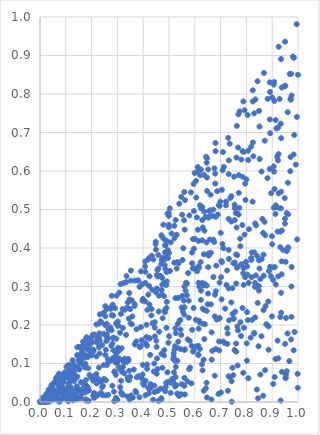
| Category | Series 0 |
|---|---|
| 0.833959607777957 | 0.309 |
| 0.6226710553488027 | 0.363 |
| 0.8251685102199416 | 0.674 |
| 0.012151044901735353 | 0.003 |
| 0.5100612519025949 | 0.438 |
| 0.18344398618494706 | 0.117 |
| 0.8451205923420376 | 0.01 |
| 0.28366670640286307 | 0.166 |
| 0.41277147064092334 | 0.201 |
| 0.012035645954408869 | 0.01 |
| 0.5590432025219347 | 0.227 |
| 0.4746178525892809 | 0.089 |
| 0.5367674675868574 | 0.36 |
| 0.6646893869289398 | 0.006 |
| 0.4807313719696039 | 0.275 |
| 0.45396182067385993 | 0.113 |
| 0.5211889334310936 | 0.136 |
| 0.5491861876958413 | 0.047 |
| 0.604805082778155 | 0.574 |
| 0.6305408393509706 | 0.242 |
| 0.754084257331752 | 0.135 |
| 0.5894717655045798 | 0.388 |
| 0.34763606515275536 | 0.006 |
| 0.8592274394965205 | 0.371 |
| 0.09431606015589489 | 0.033 |
| 0.7606637263769419 | 0.308 |
| 0.7229621349828271 | 0.304 |
| 0.11152272997416401 | 0.077 |
| 0.6814482297791011 | 0.481 |
| 0.39713254151396615 | 0.263 |
| 0.5211859210822416 | 0.047 |
| 0.4159052331790971 | 0.239 |
| 0.241000881381631 | 0.039 |
| 0.6623907402288559 | 0.388 |
| 0.6169430710544703 | 0.211 |
| 0.6145140374580985 | 0.31 |
| 0.8947439840404324 | 0.327 |
| 0.33929217641608544 | 0.014 |
| 0.6965676998924749 | 0.509 |
| 0.24132786487038038 | 0.018 |
| 0.07355799330908541 | 0.024 |
| 0.6722575808812681 | 0.324 |
| 0.17070888375426452 | 0.154 |
| 0.2901540970800738 | 0.08 |
| 0.19177080434794314 | 0.07 |
| 0.328968232632865 | 0.112 |
| 0.9520864763153227 | 0.364 |
| 0.6588788865575279 | 0.483 |
| 0.17969806234709285 | 0.041 |
| 0.7419712597005883 | 0.469 |
| 0.7953537723282129 | 0.567 |
| 0.5357532160614694 | 0.157 |
| 0.00012499267659760172 | 0 |
| 0.28786149217454327 | 0.078 |
| 0.2848459201069923 | 0.167 |
| 0.3831961423888054 | 0.067 |
| 0.21846065643484724 | 0.019 |
| 0.9084010968984554 | 0.782 |
| 0.9830189537162006 | 0.643 |
| 0.1742334713301722 | 0.144 |
| 0.15863424309363738 | 0.032 |
| 0.3514246953496212 | 0.204 |
| 0.8873149427223269 | 0.34 |
| 0.7541911592951978 | 0.512 |
| 0.0013404993351963101 | 0.001 |
| 0.026551623690384107 | 0.003 |
| 0.5590089431235028 | 0.042 |
| 0.36362376207292246 | 0.084 |
| 0.31437262872194016 | 0.055 |
| 0.931339032026711 | 0.402 |
| 0.45873597192071924 | 0.346 |
| 0.9349253417569103 | 0.232 |
| 0.4554594115107503 | 0.086 |
| 0.7851669524816784 | 0.244 |
| 0.07399829673349656 | 0.074 |
| 0.17569508749476015 | 0.1 |
| 0.4093633814592911 | 0.153 |
| 0.03259081062714586 | 0.02 |
| 0.6154326280270119 | 0.353 |
| 0.7324862995069761 | 0.372 |
| 0.8860631247897502 | 0.196 |
| 0.8268809891996235 | 0.638 |
| 0.0652342487036972 | 0.065 |
| 0.13265059318889771 | 0.078 |
| 0.8330064581968353 | 0.299 |
| 0.8378015006847976 | 0.459 |
| 0.7089843072402539 | 0.649 |
| 0.9342638891222894 | 0.891 |
| 0.4153781210567363 | 0.097 |
| 0.9839243708806429 | 0.894 |
| 0.7771537061452198 | 0.207 |
| 0.675995772559029 | 0.607 |
| 0.00022824409497024245 | 0 |
| 0.24314693610482208 | 0.042 |
| 0.32518291074286587 | 0.104 |
| 0.7850261044026805 | 0.651 |
| 0.05876385626744096 | 0.05 |
| 0.057420324258755984 | 0.025 |
| 0.0009933494473034488 | 0.001 |
| 0.5601404564813833 | 0.3 |
| 0.8723782409775844 | 0.083 |
| 0.4530186476020873 | 0.294 |
| 0.1966988673270469 | 0.166 |
| 0.2556596154903146 | 0.056 |
| 0.6360563813327799 | 0.494 |
| 0.17795882003242602 | 0.163 |
| 0.11704720859172668 | 0.065 |
| 0.6080444964961748 | 0.597 |
| 0.5228279167537708 | 0.145 |
| 0.7547765485086769 | 0.504 |
| 0.20620483672189394 | 0.056 |
| 0.1671974046558482 | 0.049 |
| 0.6458250187442274 | 0.622 |
| 0.45666417532194437 | 0.029 |
| 0.17573678013603422 | 0.03 |
| 0.47970845637960546 | 0.309 |
| 0.42714531539202305 | 0.122 |
| 0.6135932999505098 | 0.146 |
| 0.5193388570370386 | 0.077 |
| 0.8012105932541005 | 0.152 |
| 0.08939917987980972 | 0.067 |
| 0.0701271884628798 | 0.003 |
| 0.010058383971933482 | 0 |
| 0.03218893167927073 | 0.025 |
| 0.4949036240662573 | 0.052 |
| 0.614179205393404 | 0.349 |
| 0.6454982497632263 | 0.415 |
| 0.21002814752022125 | 0.011 |
| 0.913449701912242 | 0.511 |
| 0.2820436860818025 | 0.114 |
| 0.4736522631794605 | 0.429 |
| 0.8918598451230361 | 0.351 |
| 0.6470528169451691 | 0.583 |
| 0.2934280004258568 | 0.119 |
| 0.13203194914779937 | 0.069 |
| 0.12139377690033448 | 0.036 |
| 0.4223300572874672 | 0.023 |
| 0.9312798920384423 | 0.442 |
| 0.780417967334389 | 0.63 |
| 0.8542873085026029 | 0.319 |
| 0.6191035204449813 | 0.207 |
| 0.3027246130657507 | 0.141 |
| 0.9748770617847526 | 0.221 |
| 0.43219365528799714 | 0.242 |
| 0.31589254291722935 | 0.079 |
| 0.8219531956153688 | 0.213 |
| 0.8514042546203778 | 0.631 |
| 0.3074391381000995 | 0.113 |
| 0.7843229524565201 | 0.46 |
| 0.7516719460236485 | 0.216 |
| 0.03562717405975724 | 0.024 |
| 0.8430314052626063 | 0.833 |
| 0.29664460010088967 | 0.126 |
| 0.7630914587119858 | 0.349 |
| 0.6528838975686463 | 0.479 |
| 0.7494257115505281 | 0.36 |
| 0.6360950947440668 | 0.239 |
| 0.8487684091240306 | 0.368 |
| 0.42504391043390366 | 0.165 |
| 0.9958001661790685 | 0.74 |
| 0.634630115035484 | 0.303 |
| 0.6372381703803102 | 0.445 |
| 0.19891877660012625 | 0.124 |
| 0.05130026122976172 | 0.045 |
| 0.3105627770723074 | 0.18 |
| 0.6235563420179863 | 0.265 |
| 0.06106078023821604 | 0.055 |
| 0.5323320074563568 | 0.363 |
| 0.5307340171770101 | 0.141 |
| 0.6657571030286236 | 0.11 |
| 0.3987806941803924 | 0.096 |
| 0.49380380553003456 | 0.077 |
| 0.1640615101338585 | 0.022 |
| 0.9992881600094501 | 0.037 |
| 0.7735611900505899 | 0.755 |
| 0.8076349345542871 | 0.062 |
| 0.16676504852896445 | 0.156 |
| 0.11352817540246474 | 0.096 |
| 0.7874972326813441 | 0.335 |
| 0.9231383835181605 | 0.326 |
| 0.5818214327617146 | 0.089 |
| 0.5590764235792427 | 0.135 |
| 0.07218646402384887 | 0.023 |
| 0.7651902802271495 | 0.351 |
| 0.6382419952489125 | 0.307 |
| 0.005409793897956816 | 0.002 |
| 0.7284144854086841 | 0.029 |
| 0.5237259396356201 | 0.04 |
| 0.8649493175773108 | 0.439 |
| 0.32354654607456756 | 0.106 |
| 0.39931519278561156 | 0.268 |
| 0.7590959837387573 | 0.491 |
| 0.15917327652617985 | 0.01 |
| 0.5386054868129053 | 0.016 |
| 0.5956322151909318 | 0.133 |
| 0.3441336157315328 | 0.216 |
| 0.2365039836512356 | 0.208 |
| 0.30756575069617864 | 0.284 |
| 0.1537761340518986 | 0.142 |
| 0.08379912672058965 | 0.049 |
| 0.46874578643662845 | 0.327 |
| 0.12715048327276357 | 0.004 |
| 0.1925131087311035 | 0.134 |
| 0.3420041435143686 | 0.057 |
| 0.4977438988003374 | 0.154 |
| 0.13089259617364635 | 0.075 |
| 0.4202964163083702 | 0.036 |
| 0.18336322496301083 | 0.029 |
| 0.6791836721355863 | 0.593 |
| 0.4606364200192682 | 0.276 |
| 0.08415762183025066 | 0.04 |
| 0.9618032772461186 | 0.488 |
| 0.8960865616772591 | 0.542 |
| 0.6469249859818891 | 0.633 |
| 0.265123813505857 | 0.189 |
| 0.18903863786529784 | 0.003 |
| 0.09122553900266339 | 0.032 |
| 0.044374047453418886 | 0.044 |
| 0.023458868025167057 | 0.009 |
| 0.68159061267177 | 0.288 |
| 0.19240803568806497 | 0.147 |
| 0.27437358079804364 | 0.242 |
| 0.48718013156291595 | 0.039 |
| 0.2905249983109318 | 0.244 |
| 0.7460045642261214 | 0.089 |
| 0.01752089041506466 | 0.007 |
| 0.31063206381820585 | 0.086 |
| 0.16300756881896183 | 0.131 |
| 0.5342945247929611 | 0.203 |
| 0.07292131335008512 | 0.035 |
| 0.6792653849988308 | 0.567 |
| 0.10993474614097842 | 0.002 |
| 0.28093259177713514 | 0.152 |
| 0.11353467199177192 | 0.031 |
| 0.3859770604652849 | 0.143 |
| 0.6717385534901874 | 0.421 |
| 0.17859016227024327 | 0.142 |
| 0.7051501977824058 | 0.551 |
| 0.6848825939043971 | 0.214 |
| 0.20280251730611476 | 0.156 |
| 0.3206382633075894 | 0.242 |
| 0.003879752239746459 | 0.001 |
| 0.6389302638676487 | 0.202 |
| 0.29116972424189713 | 0.103 |
| 0.46213489313264156 | 0.328 |
| 0.27008998687326147 | 0.189 |
| 0.03371226121474491 | 0.032 |
| 0.312766847037799 | 0.306 |
| 0.7004183731758292 | 0.439 |
| 0.48596632299771303 | 0.346 |
| 0.04684658716814971 | 0.012 |
| 0.25815406436819865 | 0.169 |
| 0.09268364599441792 | 0.06 |
| 0.7600152142725528 | 0.152 |
| 0.10316793061152063 | 0.015 |
| 0.5993857320656898 | 0.595 |
| 0.45534937054975644 | 0.326 |
| 0.1322812148121819 | 0.054 |
| 0.6003271025132341 | 0.347 |
| 0.6803432003481387 | 0.673 |
| 0.7039524253777582 | 0.267 |
| 0.1068169246598818 | 0.02 |
| 0.5126687913076894 | 0.06 |
| 0.7709069489476759 | 0.589 |
| 0.09186608797823204 | 0.011 |
| 0.1238448932752243 | 0.026 |
| 0.026219618310704962 | 0.007 |
| 0.7416305989574528 | 0.535 |
| 0.12080840651573455 | 0.083 |
| 0.8056403300990217 | 0.213 |
| 0.735502343685895 | 0.671 |
| 0.6750887692753811 | 0.416 |
| 0.03911077516889916 | 0.035 |
| 0.8907726450044473 | 0.734 |
| 0.1446820147846012 | 0.142 |
| 0.5239364366078132 | 0.107 |
| 0.44785518640265454 | 0.41 |
| 0.16938684758409173 | 0.115 |
| 0.2784157744533058 | 0.276 |
| 0.13657755155522489 | 0.014 |
| 0.52074095761606 | 0.458 |
| 0.37028483268959445 | 0.028 |
| 0.5151927915199133 | 0.058 |
| 0.6537336563456011 | 0.38 |
| 0.5259590532087067 | 0.179 |
| 0.7106167858561093 | 0.399 |
| 0.33332677230611873 | 0.311 |
| 0.7079614377775263 | 0.602 |
| 0.44933634196347216 | 0.396 |
| 0.15485469147707331 | 0.012 |
| 0.5583173173764115 | 0.472 |
| 0.6173973045862329 | 0.3 |
| 0.0174165863986967 | 0.001 |
| 0.9090396055887607 | 0.553 |
| 0.5695108375879797 | 0.277 |
| 0.06615958233106223 | 0.011 |
| 0.07684801128094276 | 0.042 |
| 0.4701828510059358 | 0.358 |
| 0.6607049933443183 | 0.498 |
| 0.109788446425514 | 0.007 |
| 0.7072601835574871 | 0.41 |
| 0.834061370843019 | 0.464 |
| 0.9251251527490173 | 0.542 |
| 0.6210697669735781 | 0.589 |
| 0.49126234836140037 | 0.26 |
| 0.44416475432843516 | 0.026 |
| 0.26342542052429074 | 0.111 |
| 0.9247442024503574 | 0.644 |
| 0.6348517263677957 | 0.029 |
| 0.3662801395602844 | 0.315 |
| 0.9194714565838554 | 0.637 |
| 0.7312795276914247 | 0.476 |
| 0.8586787878264481 | 0.599 |
| 0.8405229008822986 | 0.032 |
| 0.4705264714382392 | 0.01 |
| 0.9752549321394042 | 0.796 |
| 0.524736487670914 | 0.191 |
| 0.4031796420946995 | 0.044 |
| 0.9058240386377426 | 0.825 |
| 0.8046975446028467 | 0.745 |
| 0.1866503376939732 | 0.088 |
| 0.09746370231051549 | 0.014 |
| 0.1403202329936425 | 0.03 |
| 0.16947671140377507 | 0.156 |
| 0.14905327613137487 | 0.107 |
| 0.033987579731038164 | 0.028 |
| 0.9002177004255609 | 0.41 |
| 0.25317142600392795 | 0.249 |
| 0.06984769335239926 | 0.055 |
| 0.14695486551239667 | 0.092 |
| 0.9332824450294477 | 0.723 |
| 0.15235243962600564 | 0.084 |
| 0.20434698802761264 | 0.174 |
| 0.22099973495467273 | 0.016 |
| 0.1759302817048667 | 0.045 |
| 0.3666544766498625 | 0.25 |
| 0.3218183979605178 | 0.091 |
| 0.08358583511380069 | 0.045 |
| 0.52047309734992 | 0.362 |
| 0.8184968746569611 | 0.374 |
| 0.7311440164982931 | 0.295 |
| 0.7456369022538248 | 0.296 |
| 0.4824591912336822 | 0.033 |
| 0.31645436872376653 | 0.14 |
| 0.6054712570546911 | 0.531 |
| 0.4077367935563775 | 0.365 |
| 0.3677754989956098 | 0.149 |
| 0.23700594667030817 | 0.054 |
| 0.48465975533036576 | 0.389 |
| 0.6611170084690242 | 0.539 |
| 0.48182607322437787 | 0.135 |
| 0.9070298105162466 | 0.598 |
| 0.5929165161256216 | 0.423 |
| 0.4695236778267493 | 0.006 |
| 0.5300620625689053 | 0.434 |
| 0.5765988237623709 | 0.219 |
| 0.6939150183138585 | 0.157 |
| 0.28431391163891295 | 0.134 |
| 0.6776279457164229 | 0.222 |
| 0.18032230244515313 | 0.168 |
| 0.17790450404980174 | 0.007 |
| 0.29424246100041807 | 0.011 |
| 0.2002202019729119 | 0.122 |
| 0.8300762103303957 | 0.18 |
| 0.07605762905105762 | 0.059 |
| 0.27784363861575667 | 0.226 |
| 0.43510655316920965 | 0.291 |
| 0.4359981239190699 | 0.205 |
| 0.6991444847292607 | 0.52 |
| 0.25914169598510084 | 0.176 |
| 0.6308840146389669 | 0.453 |
| 0.23146037569273692 | 0.16 |
| 0.5609150719514316 | 0.448 |
| 0.5211258601368414 | 0.425 |
| 0.47292264202881074 | 0.279 |
| 0.9164122228630264 | 0.71 |
| 0.02132060576485073 | 0.006 |
| 0.5285503586335774 | 0.044 |
| 0.3356892358057232 | 0.104 |
| 0.006076094320715764 | 0.001 |
| 0.5783042387754592 | 0.085 |
| 0.15292011433330321 | 0.143 |
| 0.7310622843068386 | 0.395 |
| 0.061768810295306564 | 0.061 |
| 0.47330683696121467 | 0.322 |
| 0.7885337274794323 | 0.348 |
| 0.9663632842821747 | 0.106 |
| 0.09041043371832735 | 0.052 |
| 0.3914538839761007 | 0.146 |
| 0.3737974340948247 | 0.189 |
| 0.2301107302432024 | 0.178 |
| 0.18415478961437537 | 0.153 |
| 0.7755990318721112 | 0.424 |
| 0.9711388401378247 | 0.636 |
| 0.30188325070982114 | 0.209 |
| 0.8900667941272077 | 0.606 |
| 0.9562821249112973 | 0.491 |
| 0.1995387302620295 | 0.156 |
| 0.7855416258486917 | 0.585 |
| 0.80018411004283 | 0.578 |
| 0.4709816934934684 | 0.433 |
| 0.49937000127685427 | 0.454 |
| 0.3492770445981559 | 0.241 |
| 0.2985622670040029 | 0.104 |
| 0.3354262001809596 | 0.327 |
| 0.30216815314633616 | 0.131 |
| 0.8469356866281121 | 0.145 |
| 0.16601055325174796 | 0.146 |
| 0.31770265840907197 | 0.02 |
| 0.7466769929050261 | 0.229 |
| 0.9702085603128222 | 0.6 |
| 0.037293021643189594 | 0.006 |
| 0.045224243615643256 | 0.006 |
| 0.7175535875854553 | 0.242 |
| 0.10761661899143571 | 0.024 |
| 0.42706897764005236 | 0.036 |
| 0.22023258715065985 | 0.05 |
| 0.8037279811422882 | 0.331 |
| 0.5315009155925511 | 0.022 |
| 0.09649286142749802 | 0.077 |
| 0.7950540302063315 | 0.324 |
| 0.8702663150289356 | 0.468 |
| 0.6463518738948396 | 0.302 |
| 0.11352852657249335 | 0.061 |
| 0.97533031690708 | 0.351 |
| 0.36676503306104447 | 0.255 |
| 0.6080985089563959 | 0.48 |
| 0.6514577230009592 | 0.282 |
| 0.019367671040001366 | 0 |
| 0.6534071358532898 | 0.386 |
| 0.9470833122979553 | 0.82 |
| 0.10949548509197371 | 0.041 |
| 0.9124631997062107 | 0.488 |
| 0.3469766425376679 | 0.266 |
| 0.4083573482315336 | 0.261 |
| 0.14471703188814744 | 0.03 |
| 0.899949236352063 | 0.791 |
| 0.9719082507130902 | 0.785 |
| 0.9287630298917388 | 0.787 |
| 0.6285785205073489 | 0.507 |
| 0.3421468771982954 | 0.112 |
| 0.16489858669580837 | 0.14 |
| 0.23225031883322955 | 0.228 |
| 0.9499682263682483 | 0.936 |
| 0.60528591660158 | 0.145 |
| 0.8991352854225045 | 0.431 |
| 0.9969589493307961 | 0.422 |
| 0.4858951780225206 | 0.407 |
| 0.8663556503366516 | 0.383 |
| 0.7127765909752171 | 0.611 |
| 0.20636506583495262 | 0.136 |
| 0.03998135719348472 | 0.026 |
| 0.36906582392193343 | 0.152 |
| 0.5259341938787029 | 0.473 |
| 0.3495434326537076 | 0.065 |
| 0.0366949992770802 | 0.033 |
| 0.14455916672019486 | 0.122 |
| 0.5034145966216028 | 0.503 |
| 0.9133467244503457 | 0.732 |
| 0.2766121874142565 | 0.146 |
| 0.624348691886188 | 0.503 |
| 0.681583630548066 | 0.138 |
| 0.7927384020902369 | 0.758 |
| 0.5551110863529584 | 0.399 |
| 0.2571739504407533 | 0.245 |
| 0.45501120046276666 | 0.343 |
| 0.5878055822865559 | 0.146 |
| 0.18146626504988828 | 0.004 |
| 0.20622538527844647 | 0.017 |
| 0.04438110764664882 | 0.024 |
| 0.7765951422327464 | 0.405 |
| 0.7294442659059436 | 0.686 |
| 0.3812142258480521 | 0.316 |
| 0.03734583602610708 | 0.023 |
| 0.7361962098078985 | 0.065 |
| 0.5474494069434721 | 0.02 |
| 0.011141857484843642 | 0.011 |
| 0.6475868214920371 | 0.548 |
| 0.9745788449215858 | 0.3 |
| 0.9497790554503536 | 0.151 |
| 0.24684616512433433 | 0.096 |
| 0.04925870762020057 | 0.034 |
| 0.08536164003830382 | 0.034 |
| 0.006366767515818106 | 0.002 |
| 0.40821140034001013 | 0.309 |
| 0.10947339730966021 | 0.011 |
| 0.7153716923693295 | 0.153 |
| 0.7626347944998788 | 0.717 |
| 0.7261587019641037 | 0.151 |
| 0.8916290708534894 | 0.805 |
| 0.5000302794975845 | 0.387 |
| 0.15083559114593348 | 0.111 |
| 0.5698224783812994 | 0.308 |
| 0.35377601348401244 | 0.017 |
| 0.42456117679547656 | 0.166 |
| 0.49113056373564035 | 0.418 |
| 0.04685599420809594 | 0.029 |
| 0.5319748484190366 | 0.107 |
| 0.39849453721204264 | 0.048 |
| 0.10503182123159827 | 0.032 |
| 0.7481232125551354 | 0.217 |
| 0.32579040899911615 | 0.309 |
| 0.2184743618247278 | 0.073 |
| 0.12644947075199675 | 0.109 |
| 0.1349177469091507 | 0.093 |
| 0.38577682075759223 | 0.299 |
| 0.9364743530108726 | 0.365 |
| 0.5597326387631563 | 0.063 |
| 0.8779984678649008 | 0.201 |
| 0.25511942973012014 | 0.135 |
| 0.3289125154133191 | 0.24 |
| 0.3978135778163039 | 0.072 |
| 0.6946158634705639 | 0.134 |
| 0.920867691715472 | 0.159 |
| 0.7313044266376523 | 0.592 |
| 0.4435068936123854 | 0.042 |
| 0.8825394297224133 | 0.788 |
| 0.1047067990519327 | 0.008 |
| 0.9215630507416424 | 0.505 |
| 0.44539245318977516 | 0.17 |
| 0.9913784871160747 | 0.617 |
| 0.2644156270762478 | 0.018 |
| 0.9040468164414891 | 0.047 |
| 0.525134263127627 | 0.27 |
| 0.7896074347644882 | 0.65 |
| 0.2873983407866336 | 0.002 |
| 0.3459482911313869 | 0.283 |
| 0.5659484559342818 | 0.31 |
| 0.22999145901868245 | 0.204 |
| 0.764954864577371 | 0.196 |
| 0.7927410465074778 | 0.435 |
| 0.8067280677071462 | 0.652 |
| 0.17564728231501547 | 0.042 |
| 0.9866169802197388 | 0.182 |
| 0.645743844465288 | 0.05 |
| 0.4091859691844453 | 0.055 |
| 0.9061003630092116 | 0.505 |
| 0.5897055442422516 | 0.36 |
| 0.25326802335691845 | 0.017 |
| 0.89236578524832 | 0.698 |
| 0.8417738490905305 | 0.379 |
| 0.7018738949177821 | 0.324 |
| 0.259879640196369 | 0.096 |
| 0.45855133834103956 | 0.382 |
| 0.9057688340580586 | 0.612 |
| 0.4714974920945373 | 0.291 |
| 0.2960069195696686 | 0.164 |
| 0.2702446091304239 | 0.106 |
| 0.030248795084024782 | 0.02 |
| 0.8908333012221306 | 0.83 |
| 0.9532539952509147 | 0.071 |
| 0.6653583252235477 | 0.181 |
| 0.4244845348741553 | 0.327 |
| 0.13907561091623277 | 0.021 |
| 0.7672746830662629 | 0.186 |
| 0.9371054460285254 | 0.817 |
| 0.3430506419455083 | 0.108 |
| 0.07089629457479174 | 0.061 |
| 0.1507989034870829 | 0.029 |
| 0.6960290259134018 | 0.218 |
| 0.16959698968780446 | 0.124 |
| 0.09989649419243596 | 0.066 |
| 0.8508252346389601 | 0.715 |
| 0.022523941372692757 | 0.018 |
| 0.9731929998947193 | 0.852 |
| 0.3557474097021992 | 0.202 |
| 0.655793947542446 | 0.496 |
| 0.5448391834023459 | 0.188 |
| 0.4994484376988696 | 0.484 |
| 0.6197003410550966 | 0.138 |
| 0.1477812869965398 | 0.029 |
| 0.17744852290243507 | 0.091 |
| 0.13957835865478785 | 0.009 |
| 0.669314464392988 | 0.483 |
| 0.6892209496778928 | 0.487 |
| 0.4755193540914381 | 0.218 |
| 0.10256779703852237 | 0.092 |
| 0.1816107035939203 | 0.041 |
| 0.8097352382289416 | 0.449 |
| 0.47156771692922994 | 0.369 |
| 0.14307554840683845 | 0.041 |
| 0.018168245064737798 | 0.001 |
| 0.20805846618525936 | 0.133 |
| 0.4431233091690543 | 0.1 |
| 0.40893796686994666 | 0.017 |
| 0.8364719344773736 | 0.329 |
| 0.10939991988227737 | 0.075 |
| 0.9428454197159135 | 0.394 |
| 0.008733777295629408 | 0.003 |
| 0.7983777312360123 | 0.364 |
| 0.39088496920575566 | 0.194 |
| 0.7905867000206582 | 0.193 |
| 0.4854416618187274 | 0.407 |
| 0.2834456357461692 | 0.225 |
| 0.4740241629319617 | 0.305 |
| 0.8092330992110693 | 0.31 |
| 0.646266586981864 | 0.237 |
| 0.036831085125451746 | 0.001 |
| 0.15515351313496972 | 0.104 |
| 0.2247417716365171 | 0.061 |
| 0.17294661258986221 | 0.09 |
| 0.10107885731821176 | 0.02 |
| 0.830200406248264 | 0.75 |
| 0.0039354400153776 | 0.002 |
| 0.09467154529642474 | 0.062 |
| 0.04265524718283398 | 0.021 |
| 0.6004243212009001 | 0.424 |
| 0.7552271036479941 | 0.362 |
| 0.2583277408376369 | 0.241 |
| 0.9496062494284508 | 0.476 |
| 0.871293455419114 | 0.679 |
| 0.9608361441697197 | 0.569 |
| 0.05873614393902238 | 0.02 |
| 0.21028383887422597 | 0.023 |
| 0.9239514665934425 | 0.113 |
| 0.4811615626232052 | 0.121 |
| 0.3936109417221805 | 0.062 |
| 0.15426206021903743 | 0.121 |
| 0.6331411403847914 | 0.203 |
| 0.028063315112538012 | 0.009 |
| 0.5763925882333765 | 0.263 |
| 0.16497621164763188 | 0.142 |
| 0.08927558745762854 | 0.062 |
| 0.33812539305627876 | 0.246 |
| 0.13879760480893666 | 0.062 |
| 0.24795615162663642 | 0.06 |
| 0.9346809235019169 | 0.685 |
| 0.025701347779619188 | 0.002 |
| 0.9140091560824508 | 0.305 |
| 0.21905579852237278 | 0.201 |
| 0.47836639904580736 | 0.46 |
| 0.7621071117834239 | 0.453 |
| 0.7660850950891561 | 0.095 |
| 0.6774768828467919 | 0.068 |
| 0.37537273100994717 | 0.064 |
| 0.40864575422562444 | 0.338 |
| 0.5512986698354297 | 0.275 |
| 0.04202895381688443 | 0.026 |
| 0.45241100529301614 | 0.073 |
| 0.007922320508342628 | 0.003 |
| 0.9374414627166485 | 0.445 |
| 0.48451007938660906 | 0.371 |
| 0.5919258311601495 | 0.347 |
| 0.9562850223949265 | 0.08 |
| 0.9326620210563418 | 0.004 |
| 0.33911949933670493 | 0.063 |
| 0.8338416174932173 | 0.22 |
| 0.5398802190881531 | 0.515 |
| 0.9594194125977075 | 0.178 |
| 0.5617205013014533 | 0.137 |
| 0.2528782786703331 | 0.223 |
| 0.5950444608863147 | 0.244 |
| 0.5870708209572815 | 0.048 |
| 0.7490422576429312 | 0.07 |
| 0.005471954440986027 | 0.004 |
| 0.902853052405711 | 0.35 |
| 0.6285792532553667 | 0.309 |
| 0.11843680595194794 | 0.055 |
| 0.7807295627735672 | 0.358 |
| 0.24662941726895082 | 0.177 |
| 0.7793066853145717 | 0.172 |
| 0.12854098290643334 | 0.099 |
| 0.18933555695887871 | 0.03 |
| 0.06161816067580139 | 0.02 |
| 0.4897275129999322 | 0.244 |
| 0.9075163058212908 | 0.831 |
| 0.057374221106263446 | 0.05 |
| 0.010109268130989446 | 0.005 |
| 0.8438940436037271 | 0.258 |
| 0.4396108279299543 | 0.37 |
| 0.7691526956861652 | 0.747 |
| 0.8848686420473 | 0.261 |
| 0.692859122762943 | 0.511 |
| 0.9510250577804015 | 0.821 |
| 0.03553916152515013 | 0.012 |
| 0.04991350503028613 | 0.035 |
| 0.043653363538731504 | 0.019 |
| 0.9377153147573879 | 0.078 |
| 0.460501504689958 | 0.235 |
| 0.5623119371311672 | 0.524 |
| 0.5475072066035404 | 0.533 |
| 0.9948638450861383 | 0.981 |
| 0.3914788235758392 | 0.339 |
| 0.6805773778923861 | 0.652 |
| 0.636869888460999 | 0.163 |
| 0.5898009783653528 | 0.188 |
| 0.6959922241432479 | 0.31 |
| 0.31390496633408704 | 0.229 |
| 0.30152909345389256 | 0.136 |
| 0.6198469584347622 | 0.511 |
| 0.10129382406108767 | 0.028 |
| 0.373421347505693 | 0.157 |
| 0.9366358835245737 | 0.332 |
| 0.6501083715980439 | 0.254 |
| 0.17401502495216847 | 0.043 |
| 0.4076144792107781 | 0.352 |
| 0.02111687937488327 | 0.001 |
| 0.8743161945411342 | 0.249 |
| 0.9487169744324364 | 0.53 |
| 0.43828461822615494 | 0.006 |
| 0.8250417405155748 | 0.781 |
| 0.2282504527027449 | 0.142 |
| 0.11871524429900504 | 0.039 |
| 0.8023766854430946 | 0.233 |
| 0.017552718717576576 | 0.008 |
| 0.8491222216397422 | 0.756 |
| 0.010074261321169842 | 0.008 |
| 0.517973828448767 | 0.127 |
| 0.23637188122650132 | 0.024 |
| 0.10560575620738066 | 0.068 |
| 0.0696311988123649 | 0.045 |
| 0.32192207850998145 | 0.019 |
| 0.15899117908163973 | 0.029 |
| 0.31427582092881423 | 0.089 |
| 0.7026200099845114 | 0.366 |
| 0.07606562360746327 | 0.001 |
| 0.49667168304911635 | 0.374 |
| 0.023427248972662906 | 0.012 |
| 0.7416787558702161 | 0.259 |
| 0.04591329725011617 | 0.04 |
| 0.027124067913383065 | 0.022 |
| 0.6134823391488068 | 0.123 |
| 0.15872920175348693 | 0.052 |
| 0.3581178409491005 | 0.222 |
| 0.6919307547204876 | 0.021 |
| 0.5643618182878202 | 0.289 |
| 0.08603333224366783 | 0.035 |
| 0.40335143331562684 | 0.054 |
| 0.9343783190177122 | 0.284 |
| 0.422967364399241 | 0.301 |
| 0.9998945508695299 | 0.85 |
| 0.5964056502491385 | 0.398 |
| 0.742559119357462 | 0.054 |
| 0.29961227102481147 | 0.005 |
| 0.22813030719150373 | 0.169 |
| 0.21852147037503278 | 0.118 |
| 0.21981955809025577 | 0.048 |
| 0.5509110586855664 | 0.486 |
| 0.4191081505080808 | 0.37 |
| 0.7644556151267774 | 0.381 |
| 0.49046895364305365 | 0.338 |
| 0.8618972978978355 | 0.476 |
| 0.10579224534615728 | 0.029 |
| 0.651716936497415 | 0.35 |
| 0.5599195248933305 | 0.246 |
| 0.24097377477348736 | 0.148 |
| 0.8542385751159144 | 0.071 |
| 0.14545852908930545 | 0.12 |
| 0.012204596624335151 | 0.004 |
| 0.5181468655875686 | 0.118 |
| 0.015298178181413769 | 0.01 |
| 0.5265050246548119 | 0.091 |
| 0.6300785624897695 | 0.082 |
| 0.81829326338527 | 0.663 |
| 0.6835287183730709 | 0.354 |
| 0.3456906105438481 | 0.081 |
| 0.2645528287845308 | 0.165 |
| 0.6429818105870053 | 0.036 |
| 0.7878189334253989 | 0.076 |
| 0.055241387586240864 | 0.018 |
| 0.1791154448283696 | 0.004 |
| 0.48705435694480337 | 0.375 |
| 0.881944885687334 | 0.582 |
| 0.5741329741720611 | 0.335 |
| 0.03884343393128764 | 0.021 |
| 0.4447459724720316 | 0.193 |
| 0.04980188708601474 | 0.006 |
| 0.9318743751084787 | 0.221 |
| 0.9709345760312397 | 0.788 |
| 0.2643348712908854 | 0.103 |
| 0.5575115622490232 | 0.263 |
| 0.35971887403227576 | 0.011 |
| 0.9622055251576977 | 0.401 |
| 0.4889090596777289 | 0.05 |
| 0.10585879810065812 | 0.007 |
| 0.3256367554849242 | 0.075 |
| 0.41472487476667197 | 0.146 |
| 0.4840063199377339 | 0.239 |
| 0.4899767048223632 | 0.193 |
| 0.8729768888254263 | 0.433 |
| 0.7104849255770039 | 0.157 |
| 0.705085507942055 | 0.363 |
| 0.32104778433746683 | 0.192 |
| 0.3048301099198587 | 0.109 |
| 0.25218607346498223 | 0.2 |
| 0.9680590761106649 | 0.852 |
| 0.11404930147591086 | 0.023 |
| 0.9225253092738046 | 0.628 |
| 0.08421175295810335 | 0.052 |
| 0.273704889895209 | 0.194 |
| 0.5789844638321823 | 0.484 |
| 0.3035043235972308 | 0.198 |
| 0.7698794553085699 | 0.487 |
| 0.9338282360000192 | 0.503 |
| 0.725510456470308 | 0.342 |
| 0.10299605372501175 | 0.03 |
| 0.17609120418494517 | 0.118 |
| 0.043308785216149226 | 0.023 |
| 0.7209418807623008 | 0.511 |
| 0.8245958123990013 | 0.81 |
| 0.9131262974369233 | 0.112 |
| 0.39397159637997914 | 0.161 |
| 0.388436165530773 | 0.143 |
| 0.5614888325815939 | 0.02 |
| 0.6122818382975173 | 0.447 |
| 0.45018174053362636 | 0.284 |
| 0.14691507927553848 | 0.009 |
| 0.6287049989828307 | 0.42 |
| 0.8193410800923521 | 0.369 |
| 0.634208987133586 | 0.11 |
| 0.18584994495904072 | 0.037 |
| 0.17145867212648191 | 0.044 |
| 0.9804296112631482 | 0.897 |
| 0.6239557142153445 | 0.604 |
| 0.1468383343892895 | 0.011 |
| 0.8582348359495751 | 0.171 |
| 0.5954833293054046 | 0.566 |
| 0.33864180571806024 | 0.108 |
| 0.48407357641586446 | 0.233 |
| 0.19743487676910687 | 0.064 |
| 0.8483061190509232 | 0.289 |
| 0.7211585352028347 | 0.52 |
| 0.6113908136845564 | 0.61 |
| 0.4223887405251331 | 0.374 |
| 0.4939763056943328 | 0.489 |
| 0.3336149059910989 | 0.174 |
| 0.885936698797524 | 0.136 |
| 0.8779026448740096 | 0.202 |
| 0.8672839746247109 | 0.328 |
| 0.7014124434453121 | 0.025 |
| 0.10381833665675211 | 0.013 |
| 0.1452417618660713 | 0.066 |
| 0.6584553025215368 | 0.422 |
| 0.9347704503635839 | 0.546 |
| 0.9536356574634953 | 0.218 |
| 0.9612045245862324 | 0.401 |
| 0.7327826360038436 | 0.212 |
| 0.7606330403175202 | 0.131 |
| 0.6086646637140524 | 0.34 |
| 0.6678320333300991 | 0.133 |
| 0.08333810610847403 | 0.069 |
| 0.48334654940844723 | 0.356 |
| 0.0070159008242605125 | 0.005 |
| 0.5849346662286075 | 0.544 |
| 0.4241911566522286 | 0.253 |
| 0.9208834027570294 | 0.443 |
| 0.8989716236890729 | 0.222 |
| 0.41971195756989743 | 0.279 |
| 0.13913473814233357 | 0.09 |
| 0.2529744008096657 | 0.122 |
| 0.5805446421217983 | 0.159 |
| 0.004216472913651348 | 0.001 |
| 0.4122730752247862 | 0.169 |
| 0.9853634930511259 | 0.693 |
| 0.9599462756910074 | 0.753 |
| 0.9833181300463701 | 0.134 |
| 0.6289958912407602 | 0.472 |
| 0.6520003198507874 | 0.604 |
| 0.8165153372797425 | 0.167 |
| 0.4993502428578662 | 0.46 |
| 0.30746910551479945 | 0.135 |
| 0.28788080324731025 | 0.115 |
| 0.48078240952440454 | 0.423 |
| 0.3450245378184177 | 0.057 |
| 0.293735920091158 | 0.071 |
| 0.5064059363666126 | 0.024 |
| 0.10780436048901176 | 0.02 |
| 0.032726041865974054 | 0.001 |
| 0.7275528944758277 | 0.178 |
| 0.8310837731003928 | 0.389 |
| 0.6147996481902764 | 0.418 |
| 0.671915445680247 | 0.5 |
| 0.8481757747513755 | 0.301 |
| 0.8206360880460721 | 0.388 |
| 0.5714514346633027 | 0.053 |
| 0.5524834440570859 | 0.369 |
| 0.8509411896480795 | 0.347 |
| 0.7523813071033973 | 0.585 |
| 0.08698033103176883 | 0.065 |
| 0.6277130799679379 | 0.098 |
| 0.08404770587191046 | 0.022 |
| 0.027360010310353178 | 0.001 |
| 0.9249637272356347 | 0.923 |
| 0.8027562371010227 | 0.352 |
| 0.8352575011293548 | 0.786 |
| 0.4409633066458163 | 0.079 |
| 0.5538109921621608 | 0.235 |
| 0.0082314996626629 | 0.003 |
| 0.022679842675355055 | 0.003 |
| 0.8020459955947953 | 0.107 |
| 0.28178084299369444 | 0.253 |
| 0.3777730932853657 | 0.316 |
| 0.8240408504847269 | 0.52 |
| 0.08776388151295933 | 0.051 |
| 0.865242156756326 | 0.016 |
| 0.28044736023671146 | 0.042 |
| 0.535280129649816 | 0.27 |
| 0.016506328770369838 | 0.012 |
| 0.5164512145690623 | 0.112 |
| 0.2725474204613999 | 0.245 |
| 0.4153042760277317 | 0.086 |
| 0.18491531970426733 | 0.121 |
| 0.011325833685549291 | 0.007 |
| 0.11039082034713588 | 0.096 |
| 0.46724908831689016 | 0.035 |
| 0.9517576542417773 | 0.061 |
| 0.16797733812006221 | 0.096 |
| 0.820107705249018 | 0.324 |
| 0.18323049409171288 | 0.137 |
| 0.9569242535139225 | 0.392 |
| 0.4315648646301735 | 0.225 |
| 0.02960193739775152 | 0.02 |
| 0.06720688285710597 | 0.064 |
| 0.5723788484666292 | 0.163 |
| 0.45205348266019396 | 0.143 |
| 0.5298291956945079 | 0.347 |
| 0.22832786297726093 | 0.089 |
| 0.7895537261081615 | 0.304 |
| 0.39647717807736704 | 0.306 |
| 0.5357768047389985 | 0.02 |
| 0.7433070005051933 | 0.001 |
| 0.1758376593495412 | 0.025 |
| 0.5474102229102525 | 0.174 |
| 0.4618367235803328 | 0.183 |
| 0.7603939879856743 | 0.383 |
| 0.772764550697417 | 0.504 |
| 0.44852489632707637 | 0.416 |
| 0.21109514018376885 | 0.068 |
| 0.5936702093508746 | 0.131 |
| 0.7378192581834626 | 0.53 |
| 0.635123761276869 | 0.384 |
| 0.7679129336913488 | 0.661 |
| 0.6143068505141147 | 0.122 |
| 0.9985670484088681 | 0.073 |
| 0.7703846384022116 | 0.543 |
| 0.13378093098988086 | 0.061 |
| 0.5004824615288022 | 0.171 |
| 0.38548845773557483 | 0.012 |
| 0.258923406007628 | 0.203 |
| 0.6623585549185279 | 0.254 |
| 0.6416944707647266 | 0.481 |
| 0.8303983967961487 | 0.178 |
| 0.4757014629638989 | 0.375 |
| 0.18661269513929513 | 0.118 |
| 0.01589266328153749 | 0.008 |
| 0.35080923098685934 | 0.315 |
| 0.9493587787973268 | 0.463 |
| 0.6781862733025706 | 0.279 |
| 0.12295658748615479 | 0.014 |
| 0.5037880420910418 | 0.34 |
| 0.33995385360021135 | 0.258 |
| 0.4510600195339266 | 0.159 |
| 0.5441710880719866 | 0.213 |
| 0.37331257449798294 | 0.025 |
| 0.6150245365374255 | 0.19 |
| 0.7614852147849881 | 0.635 |
| 0.04768105945427903 | 0.037 |
| 0.8682009596769692 | 0.855 |
| 0.05322609343997087 | 0.049 |
| 0.909578857363596 | 0.065 |
| 0.9036890524153229 | 0.317 |
| 0.5445660091763306 | 0.138 |
| 0.24811280912362754 | 0.232 |
| 0.7308251763932412 | 0.067 |
| 0.7655152694516605 | 0.49 |
| 0.20993451453454237 | 0.176 |
| 0.04265953042706483 | 0.033 |
| 0.8665855277246971 | 0.239 |
| 0.6470334799237767 | 0.012 |
| 0.28627310674698314 | 0.027 |
| 0.5068489911009004 | 0.415 |
| 0.356087935740503 | 0.264 |
| 0.45304484513215726 | 0.33 |
| 0.2946249258427096 | 0.129 |
| 0.7321106148544421 | 0.628 |
| 0.35197950896569297 | 0.341 |
| 0.08372121820000311 | 0.008 |
| 0.4958493443071399 | 0.394 |
| 0.4284590231730474 | 0.046 |
| 0.9733639089054187 | 0.162 |
| 0.4986525258606753 | 0.491 |
| 0.22155718859876428 | 0.164 |
| 0.6356356809934208 | 0.59 |
| 0.7882939058903131 | 0.781 |
| 0.9101505502263042 | 0.351 |
| 0.47054664666000023 | 0.125 |
| 0.1094161426653385 | 0.029 |
| 0.49114699034908726 | 0.313 |
| 0.3043461853595679 | 0.092 |
| 0.5490340000394961 | 0.246 |
| 0.644013747070081 | 0.637 |
| 0.3108527836338506 | 0.039 |
| 0.44511401168554243 | 0.207 |
| 0.31485908227169734 | 0.025 |
| 0.8070382483550899 | 0.628 |
| 0.6038373345391733 | 0.214 |
| 0.30074370670713846 | 0.198 |
| 0.923792742847231 | 0.713 |
| 0.9527250331582877 | 0.064 |
| 0.1142424200525266 | 0.083 |
| 0.22046374050426487 | 0.154 |
| 0.29682207207534816 | 0.276 |
| 0.2344422174932531 | 0.209 |
| 0.5068597782198501 | 0.05 |
| 0.5966100562222414 | 0.496 |
| 0.5590787291640978 | 0.545 |
| 0.5254411230310528 | 0.065 |
| 0.7568024861947347 | 0.235 |
| 0.15855929907084854 | 0.108 |
| 0.5406314855063968 | 0.211 |
| 0.7549501405266641 | 0.472 |
| 0.4883657454926309 | 0.303 |
| 0.23126316386479762 | 0.126 |
| 0.6148893000590561 | 0.347 |
| 0.4592379574787122 | 0.003 |
| 0.7254190117436645 | 0.192 |
| 0.29497643322494416 | 0.205 |
| 0.48514751270015255 | 0.028 |
| 0.6868067072550872 | 0.547 |
| 0.12503346611638422 | 0.071 |
| 0.11205364240074811 | 0.05 |
| 0.7965553981049855 | 0.525 |
| 0.4334278733978344 | 0.38 |
| 0.2776614133990669 | 0.186 |
| 0.1780638911363568 | 0.057 |
| 0.6945052016647418 | 0.217 |
| 0.6244670268035827 | 0.289 |
| 0.0414630952578523 | 0.015 |
| 0.25777328244933684 | 0.158 |